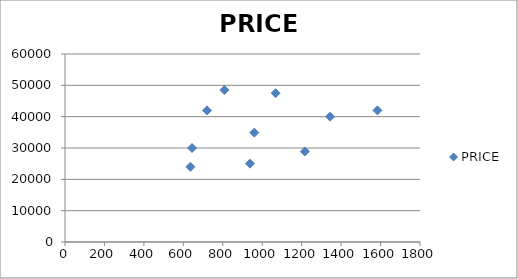
| Category | PRICE |
|---|---|
| 636.0 | 24000 |
| 938.0 | 25000 |
| 1216.0 | 28900 |
| 644.0 | 30000 |
| 960.0 | 34900 |
| 1344.0 | 40000 |
| 1584.0 | 42000 |
| 720.0 | 42000 |
| 1068.0 | 47500 |
| 808.0 | 48500 |